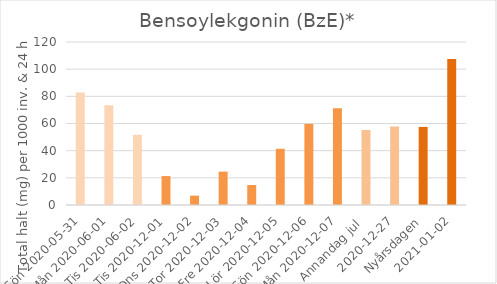
| Category | Bensoylekgonin (BzE)* |
|---|---|
| Sön 2020-05-31 | 82.8 |
| Mån 2020-06-01 | 73.5 |
|  Tis 2020-06-02 | 51.7 |
| Tis 2020-12-01 | 21.3 |
| Ons 2020-12-02 | 6.9 |
| Tor 2020-12-03 | 24.6 |
| Fre 2020-12-04 | 14.7 |
| Lör 2020-12-05 | 41.4 |
| Sön 2020-12-06 | 59.7 |
| Mån 2020-12-07 | 71.2 |
| Annandag jul  | 55.2 |
| 2020-12-27 | 57.8 |
| Nyårsdagen | 57.5 |
| 2021-01-02 | 107.5 |